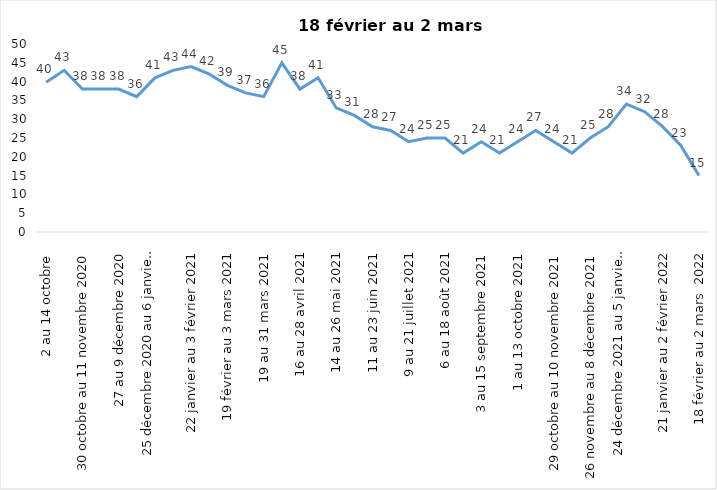
| Category | Toujours aux trois mesures |
|---|---|
| 2 au 14 octobre  | 39.85 |
| 16 au 28 octobre 2020 | 43 |
| 30 octobre au 11 novembre 2020 | 38 |
| 13 au 25 novembre 2020 | 38 |
| 27 au 9 décembre 2020 | 38 |
| 11 au 25 décembre 2020 | 36 |
| 25 décembre 2020 au 6 janvier 2021 | 41 |
| 8 au 20 janvier 2021 | 43 |
| 22 janvier au 3 février 2021 | 44 |
| 5 au 17 février 2021 | 42 |
| 19 février au 3 mars 2021 | 39 |
| 5 au 17 mars 2021 | 37 |
| 19 au 31 mars 2021 | 36 |
| 2 au 14 avril 2021 | 45 |
| 16 au 28 avril 2021 | 38 |
| 30 avril au 12 mai 2021 | 41 |
| 14 au 26 mai 2021 | 33 |
| 28 mai au 9 juin 2021 | 31 |
| 11 au 23 juin 2021 | 28 |
| 25 juin au 7 juillet 2021 | 27 |
| 9 au 21 juillet 2021 | 24 |
| 23 au 4 août 2021 | 25 |
| 6 au 18 août 2021 | 25 |
| 20 août au 1er septembre 2021 | 21 |
| 3 au 15 septembre 2021 | 24 |
| 17 au 29 septembre 2021 | 21 |
| 1 au 13 octobre 2021 | 24 |
| 15 au 27 octobre 2021 | 27 |
| 29 octobre au 10 novembre 2021 | 24 |
| 12 au 24 novembre 2021 | 21 |
| 26 novembre au 8 décembre 2021 | 25 |
| 10 au 22 décembre 2021 | 28 |
| 24 décembre 2021 au 5 janvier 2022 2022 | 34 |
| 7 au 19 janvier 2022 | 32 |
| 21 janvier au 2 février 2022 | 28 |
| 4 au 16 février 2022 | 23 |
| 18 février au 2 mars  2022 | 15 |